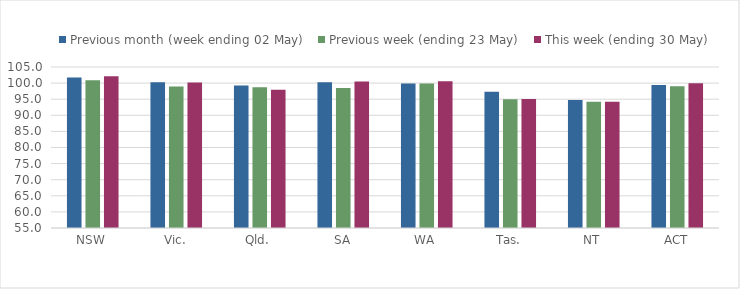
| Category | Previous month (week ending 02 May) | Previous week (ending 23 May) | This week (ending 30 May) |
|---|---|---|---|
| NSW | 101.709 | 100.912 | 102.141 |
| Vic. | 100.28 | 98.966 | 100.163 |
| Qld. | 99.216 | 98.697 | 97.955 |
| SA | 100.302 | 98.506 | 100.516 |
| WA | 99.913 | 99.913 | 100.57 |
| Tas. | 97.325 | 94.997 | 95.099 |
| NT | 94.72 | 94.181 | 94.196 |
| ACT | 99.38 | 99.018 | 99.944 |